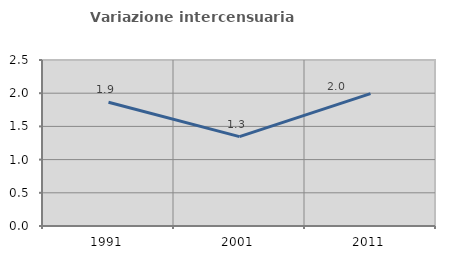
| Category | Variazione intercensuaria annua |
|---|---|
| 1991.0 | 1.863 |
| 2001.0 | 1.346 |
| 2011.0 | 1.994 |